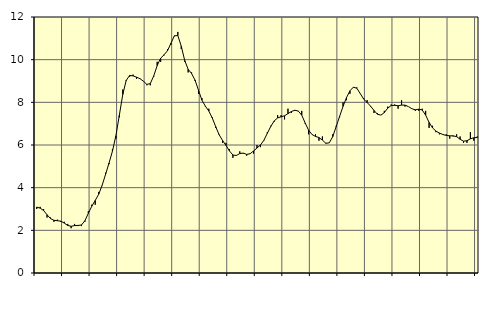
| Category | Piggar | Series 1 |
|---|---|---|
| nan | 3 | 3.09 |
| 87.0 | 3.1 | 3.04 |
| 87.0 | 3 | 2.93 |
| 87.0 | 2.6 | 2.73 |
| nan | 2.6 | 2.55 |
| 88.0 | 2.4 | 2.47 |
| 88.0 | 2.5 | 2.45 |
| 88.0 | 2.4 | 2.43 |
| nan | 2.4 | 2.34 |
| 89.0 | 2.3 | 2.23 |
| 89.0 | 2.1 | 2.19 |
| 89.0 | 2.3 | 2.22 |
| nan | 2.2 | 2.23 |
| 90.0 | 2.2 | 2.25 |
| 90.0 | 2.4 | 2.45 |
| 90.0 | 2.9 | 2.8 |
| nan | 3.2 | 3.13 |
| 91.0 | 3.2 | 3.4 |
| 91.0 | 3.8 | 3.69 |
| 91.0 | 4.1 | 4.11 |
| nan | 4.7 | 4.62 |
| 92.0 | 5.1 | 5.15 |
| 92.0 | 5.8 | 5.71 |
| 92.0 | 6.3 | 6.43 |
| nan | 7.3 | 7.39 |
| 93.0 | 8.6 | 8.37 |
| 93.0 | 9 | 9.03 |
| 93.0 | 9.2 | 9.26 |
| nan | 9.3 | 9.24 |
| 94.0 | 9.1 | 9.18 |
| 94.0 | 9.1 | 9.11 |
| 94.0 | 9 | 8.99 |
| nan | 8.8 | 8.84 |
| 95.0 | 8.8 | 8.88 |
| 95.0 | 9.2 | 9.24 |
| 95.0 | 9.9 | 9.72 |
| nan | 9.9 | 10.07 |
| 96.0 | 10.2 | 10.23 |
| 96.0 | 10.5 | 10.42 |
| 96.0 | 10.7 | 10.77 |
| nan | 11.1 | 11.12 |
| 97.0 | 11.3 | 11.13 |
| 97.0 | 10.5 | 10.63 |
| 97.0 | 9.9 | 9.96 |
| nan | 9.4 | 9.55 |
| 98.0 | 9.4 | 9.35 |
| 98.0 | 9 | 9.04 |
| 98.0 | 8.4 | 8.57 |
| nan | 8.2 | 8.1 |
| 99.0 | 7.8 | 7.82 |
| 99.0 | 7.7 | 7.59 |
| 99.0 | 7.3 | 7.27 |
| nan | 6.8 | 6.86 |
| 0.0 | 6.5 | 6.48 |
| 0.0 | 6.1 | 6.21 |
| 0.0 | 6.1 | 5.98 |
| nan | 5.8 | 5.72 |
| 1.0 | 5.4 | 5.53 |
| 1.0 | 5.5 | 5.51 |
| 1.0 | 5.7 | 5.6 |
| nan | 5.6 | 5.62 |
| 2.0 | 5.5 | 5.56 |
| 2.0 | 5.6 | 5.59 |
| 2.0 | 5.6 | 5.72 |
| nan | 6 | 5.86 |
| 3.0 | 5.9 | 6 |
| 3.0 | 6.2 | 6.22 |
| 3.0 | 6.6 | 6.55 |
| nan | 6.9 | 6.87 |
| 4.0 | 7.1 | 7.13 |
| 4.0 | 7.4 | 7.27 |
| 4.0 | 7.4 | 7.32 |
| nan | 7.2 | 7.37 |
| 5.0 | 7.7 | 7.47 |
| 5.0 | 7.5 | 7.57 |
| 5.0 | 7.6 | 7.63 |
| nan | 7.6 | 7.59 |
| 6.0 | 7.6 | 7.4 |
| 6.0 | 7 | 7.03 |
| 6.0 | 6.5 | 6.69 |
| nan | 6.5 | 6.49 |
| 7.0 | 6.5 | 6.4 |
| 7.0 | 6.2 | 6.35 |
| 7.0 | 6.4 | 6.23 |
| nan | 6.1 | 6.08 |
| 8.0 | 6.1 | 6.1 |
| 8.0 | 6.5 | 6.39 |
| 8.0 | 6.9 | 6.86 |
| nan | 7.3 | 7.34 |
| 9.0 | 8 | 7.81 |
| 9.0 | 8.1 | 8.22 |
| 9.0 | 8.4 | 8.54 |
| nan | 8.7 | 8.71 |
| 10.0 | 8.7 | 8.66 |
| 10.0 | 8.4 | 8.41 |
| 10.0 | 8.2 | 8.15 |
| nan | 8.1 | 7.99 |
| 11.0 | 7.8 | 7.82 |
| 11.0 | 7.5 | 7.62 |
| 11.0 | 7.5 | 7.44 |
| nan | 7.4 | 7.4 |
| 12.0 | 7.6 | 7.52 |
| 12.0 | 7.8 | 7.73 |
| 12.0 | 7.9 | 7.85 |
| nan | 7.9 | 7.86 |
| 13.0 | 7.7 | 7.84 |
| 13.0 | 8.1 | 7.87 |
| 13.0 | 7.8 | 7.87 |
| nan | 7.8 | 7.8 |
| 14.0 | 7.7 | 7.7 |
| 14.0 | 7.6 | 7.65 |
| 14.0 | 7.6 | 7.68 |
| nan | 7.7 | 7.64 |
| 15.0 | 7.6 | 7.4 |
| 15.0 | 6.8 | 7.06 |
| 15.0 | 6.9 | 6.8 |
| nan | 6.6 | 6.65 |
| 16.0 | 6.5 | 6.56 |
| 16.0 | 6.5 | 6.49 |
| 16.0 | 6.5 | 6.45 |
| nan | 6.3 | 6.43 |
| 17.0 | 6.4 | 6.43 |
| 17.0 | 6.5 | 6.39 |
| 17.0 | 6.4 | 6.27 |
| nan | 6.1 | 6.18 |
| 18.0 | 6.1 | 6.2 |
| 18.0 | 6.6 | 6.29 |
| 18.0 | 6.2 | 6.34 |
| nan | 6.4 | 6.35 |